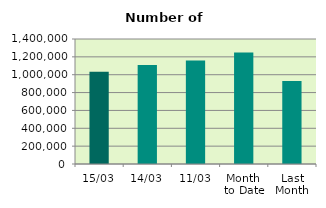
| Category | Series 0 |
|---|---|
| 15/03 | 1032966 |
| 14/03 | 1109348 |
| 11/03 | 1157934 |
| Month 
to Date | 1248998.182 |
| Last
Month | 928647.7 |